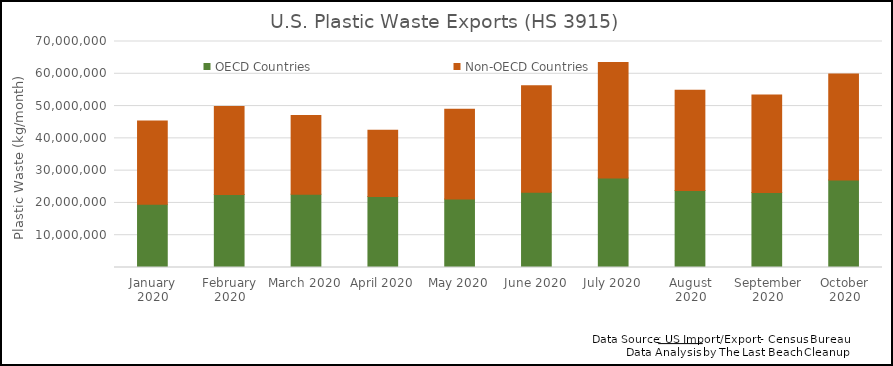
| Category | OECD Countries | Non-OECD Countries |
|---|---|---|
| January 2020 | 19583417 | 25783161 |
| February 2020 | 22605854 | 27250856 |
| March 2020 | 22704561 | 24390271 |
| April 2020 | 22016655 | 20524268 |
| May 2020 | 21248852 | 27802557 |
| June 2020 | 23287755 | 32976114 |
| July 2020 | 27684986 | 35834981 |
| August 2020 | 23872242 | 31005120 |
| September 2020 | 23208019 | 30253357 |
| October 2020 | 27089492 | 32854889 |